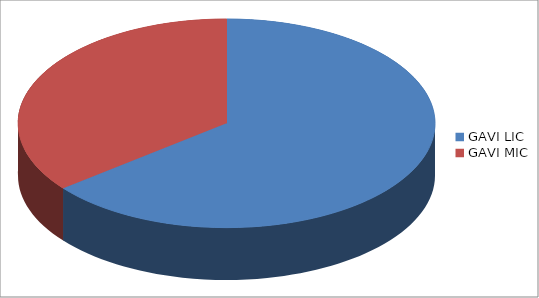
| Category | Series 0 |
|---|---|
| GAVI LIC | 1819586080 |
| GAVI MIC | 1009543760 |